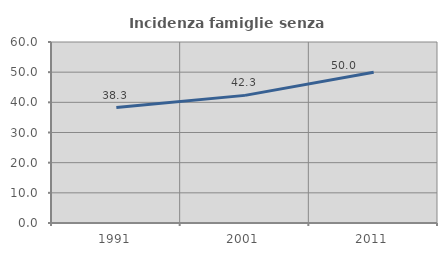
| Category | Incidenza famiglie senza nuclei |
|---|---|
| 1991.0 | 38.272 |
| 2001.0 | 42.308 |
| 2011.0 | 50 |